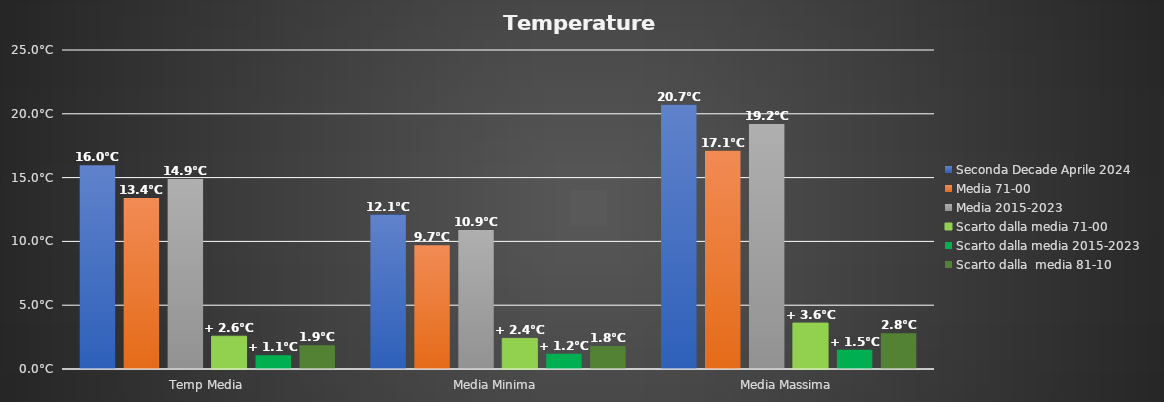
| Category | Seconda Decade Aprile 2024 | Media 71-00 | Media 2015-2023 | Scarto dalla media 71-00 | Scarto dalla media 2015-2023 | Scarto dalla  media 81-10 |
|---|---|---|---|---|---|---|
| Temp Media | 15.97 | 13.4 | 14.9 | 2.57 | 1.07 | 1.87 |
| Media Minima  | 12.1 | 9.7 | 10.9 | 2.4 | 1.2 | 1.8 |
| Media Massima | 20.7 | 17.1 | 19.2 | 3.6 | 1.5 | 2.8 |